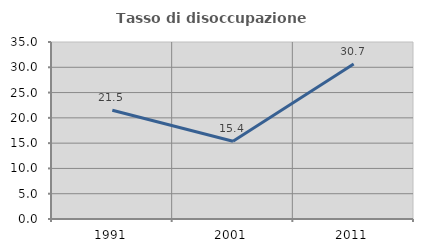
| Category | Tasso di disoccupazione giovanile  |
|---|---|
| 1991.0 | 21.491 |
| 2001.0 | 15.385 |
| 2011.0 | 30.653 |